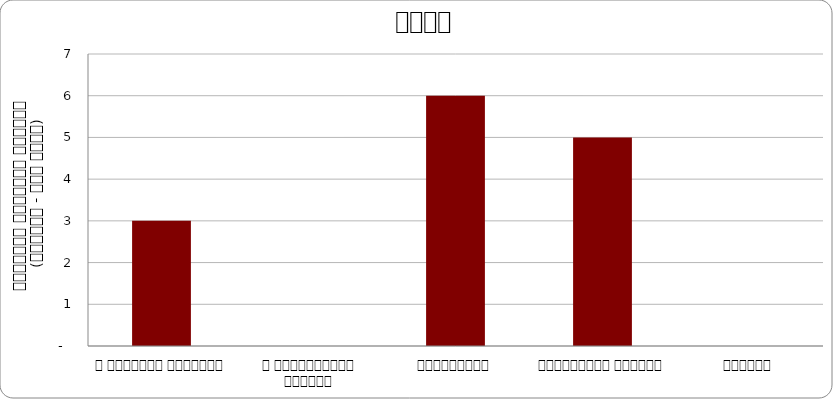
| Category | अन्य |
|---|---|
| द हिमालयन टाइम्स् | 3 |
| द काठमाण्डौं पोस्ट् | 0 |
| कान्तिपुर | 6 |
| अन्नपूर्ण पोस्ट् | 5 |
| नागरिक | 0 |